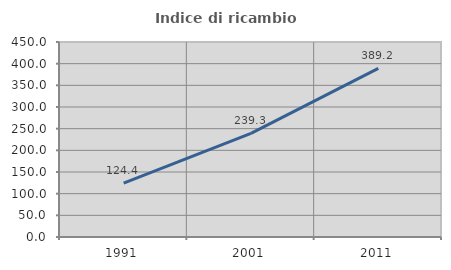
| Category | Indice di ricambio occupazionale  |
|---|---|
| 1991.0 | 124.39 |
| 2001.0 | 239.326 |
| 2011.0 | 389.231 |